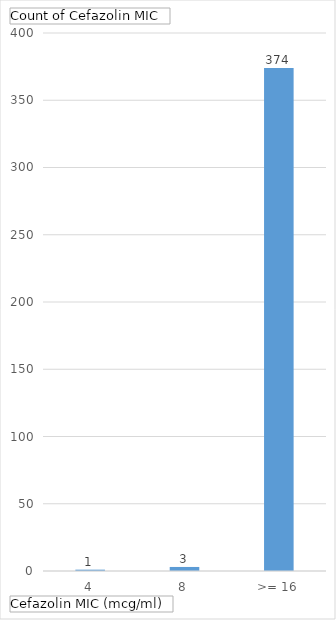
| Category | Total |
|---|---|
| 4 | 1 |
| 8 | 3 |
| >= 16 | 374 |